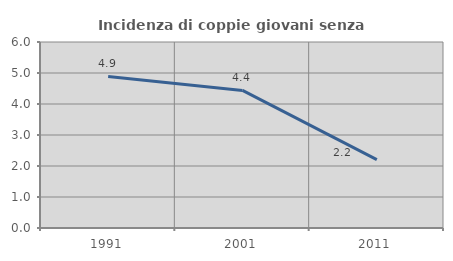
| Category | Incidenza di coppie giovani senza figli |
|---|---|
| 1991.0 | 4.891 |
| 2001.0 | 4.437 |
| 2011.0 | 2.208 |